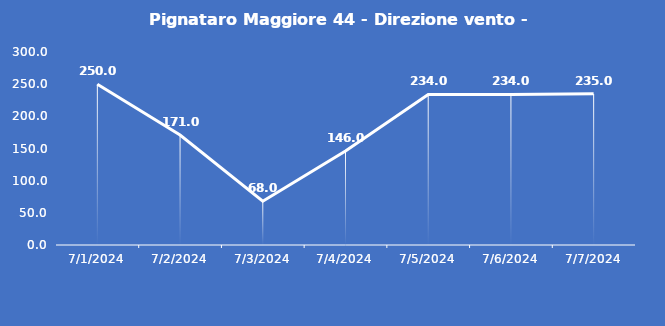
| Category | Pignataro Maggiore 44 - Direzione vento - Grezzo (°N) |
|---|---|
| 7/1/24 | 250 |
| 7/2/24 | 171 |
| 7/3/24 | 68 |
| 7/4/24 | 146 |
| 7/5/24 | 234 |
| 7/6/24 | 234 |
| 7/7/24 | 235 |